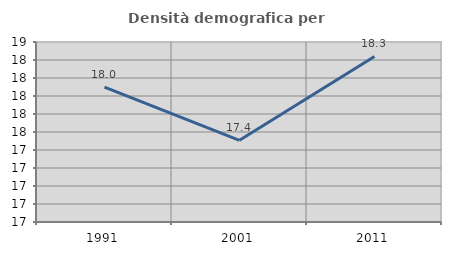
| Category | Densità demografica |
|---|---|
| 1991.0 | 17.999 |
| 2001.0 | 17.407 |
| 2011.0 | 18.339 |